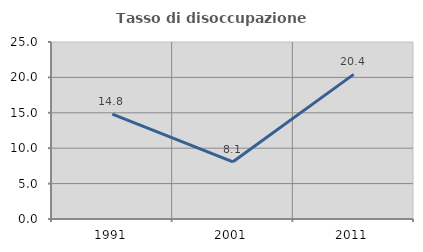
| Category | Tasso di disoccupazione giovanile  |
|---|---|
| 1991.0 | 14.827 |
| 2001.0 | 8.078 |
| 2011.0 | 20.424 |